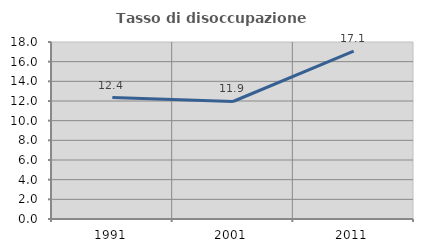
| Category | Tasso di disoccupazione giovanile  |
|---|---|
| 1991.0 | 12.355 |
| 2001.0 | 11.95 |
| 2011.0 | 17.073 |